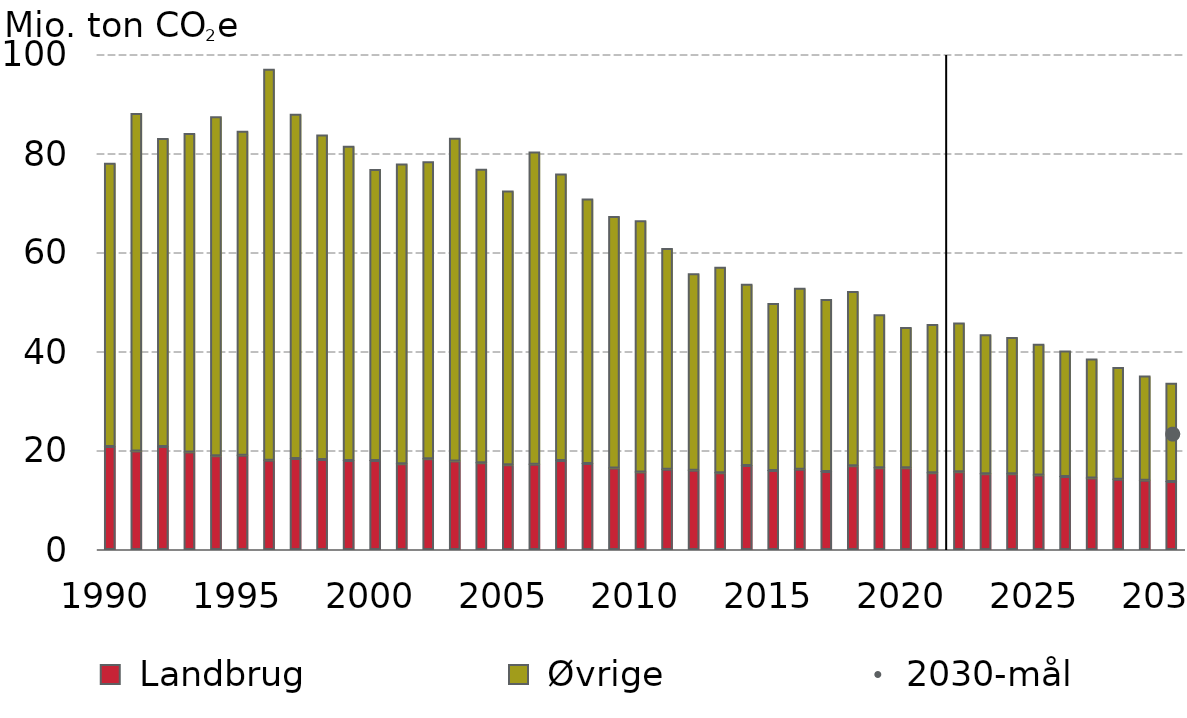
| Category |  Landbrug |  Øvrige |
|---|---|---|
| 1990.0 | 20.83 | 57.2 |
| 1991.0 | 19.89 | 68.21 |
| 1992.0 | 20.83 | 62.21 |
| 1993.0 | 19.68 | 64.37 |
| 1994.0 | 18.94 | 68.5 |
| 1995.0 | 19.04 | 65.44 |
| 1996.0 | 18.03 | 79 |
| 1997.0 | 18.4 | 69.55 |
| 1998.0 | 18.19 | 65.57 |
| 1999.0 | 17.99 | 63.45 |
| 2000.0 | 18 | 58.75 |
| 2001.0 | 17.34 | 60.52 |
| 2002.0 | 18.31 | 60 |
| 2003.0 | 17.87 | 65.22 |
| 2004.0 | 17.51 | 59.32 |
| 2005.0 | 17.11 | 55.29 |
| 2006.0 | 17.23 | 63.05 |
| 2007.0 | 17.99 | 57.85 |
| 2008.0 | 17.39 | 53.43 |
| 2009.0 | 16.47 | 50.8 |
| 2010.0 | 15.68 | 50.74 |
| 2011.0 | 16.22 | 44.6 |
| 2012.0 | 16 | 39.72 |
| 2013.0 | 15.53 | 41.49 |
| 2014.0 | 16.98 | 36.59 |
| 2015.0 | 15.95 | 33.77 |
| 2016.0 | 16.23 | 36.55 |
| 2017.0 | 15.78 | 34.7 |
| 2018.0 | 16.94 | 35.2 |
| 2019.0 | 16.52 | 30.92 |
| 2020.0 | 16.51 | 28.35 |
| 2021.0 | 15.5 | 29.97 |
| 2022.0 | 15.72 | 30.04 |
| 2023.0 | 15.31 | 28.06 |
| 2024.0 | 15.28 | 27.55 |
| 2025.0 | 15.05 | 26.39 |
| 2026.0 | 14.74 | 25.34 |
| 2027.0 | 14.43 | 24.03 |
| 2028.0 | 14.21 | 22.57 |
| 2029.0 | 14.01 | 21.06 |
| 2030.0 | 13.75 | 19.85 |